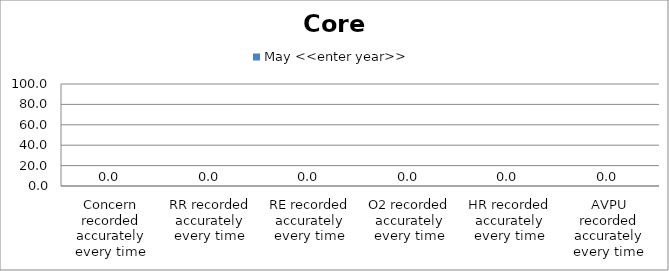
| Category | May <<enter year>> |
|---|---|
| Concern recorded accurately every time | 0 |
| RR recorded accurately every time | 0 |
| RE recorded accurately every time | 0 |
| O2 recorded accurately every time | 0 |
| HR recorded accurately every time | 0 |
| AVPU recorded accurately every time | 0 |